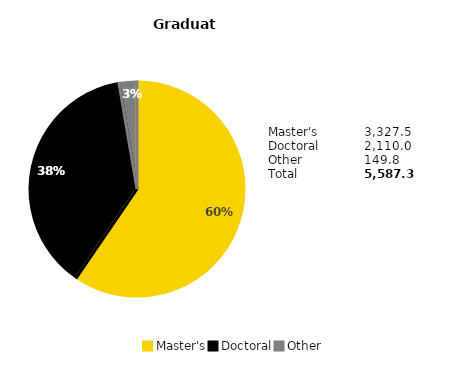
| Category | Series 0 |
|---|---|
| Master's | 0.596 |
| Doctoral | 0.378 |
| Other | 0.027 |